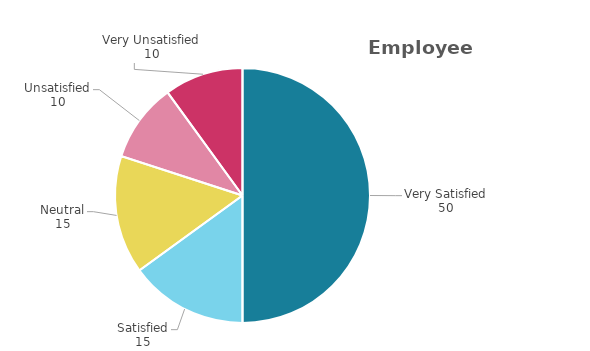
| Category | Number |
|---|---|
| Very Satisfied | 50 |
| Satisfied | 15 |
| Neutral | 15 |
| Unsatisfied | 10 |
| Very Unsatisfied | 10 |